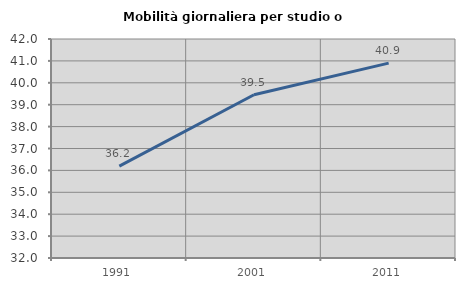
| Category | Mobilità giornaliera per studio o lavoro |
|---|---|
| 1991.0 | 36.195 |
| 2001.0 | 39.456 |
| 2011.0 | 40.9 |